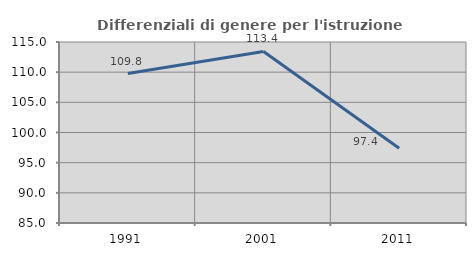
| Category | Differenziali di genere per l'istruzione superiore |
|---|---|
| 1991.0 | 109.777 |
| 2001.0 | 113.436 |
| 2011.0 | 97.38 |